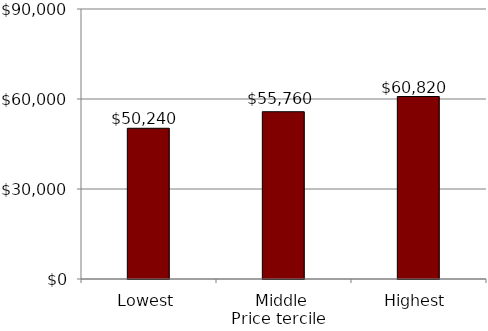
| Category | Series 0 |
|---|---|
| Lowest | 50240 |
| Middle | 55760 |
| Highest | 60820 |